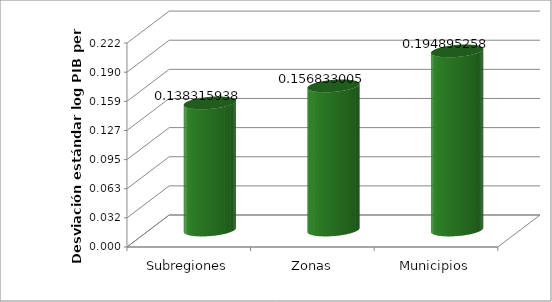
| Category | Series 0 |
|---|---|
| Subregiones | 0.138 |
| Zonas | 0.157 |
| Municipios | 0.195 |